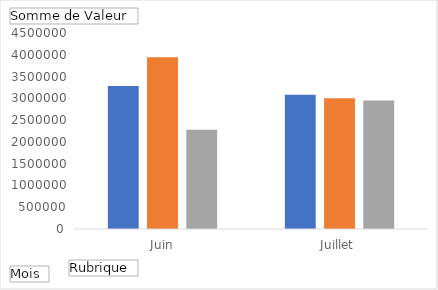
| Category | Achats de marchandises | Loyers | Salaires |
|---|---|---|---|
| Juin | 3282485 | 3941156 | 2276640 |
| Juillet | 3080836 | 3000000 | 2949357 |